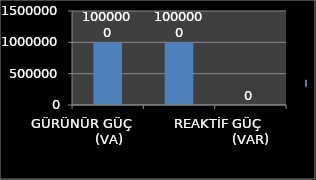
| Category | Series 0 |
|---|---|
| GÜRÜNÜR GÜÇ              (VA) | 1000000 |
| AKTİF GÜÇ                     (W) | 1000000 |
| REAKTİF GÜÇ                (VAR) | 0 |